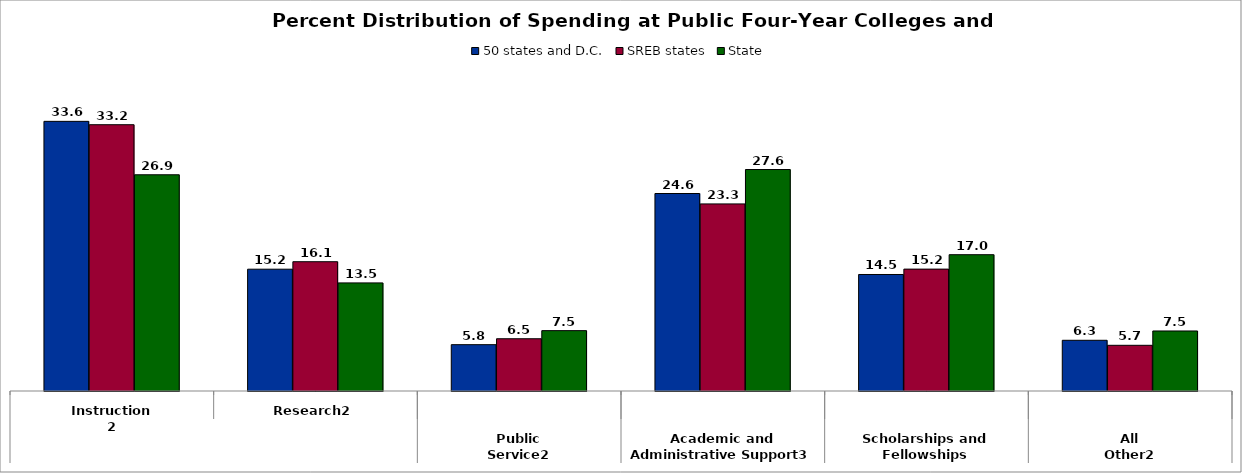
| Category | 50 states and D.C. | SREB states | State |
|---|---|---|---|
| 0 | 33.602 | 33.182 | 26.944 |
| 1 | 15.177 | 16.11 | 13.47 |
| 2 | 5.775 | 6.513 | 7.521 |
| 3 | 24.61 | 23.313 | 27.599 |
| 4 | 14.518 | 15.189 | 16.986 |
| 5 | 6.319 | 5.693 | 7.48 |